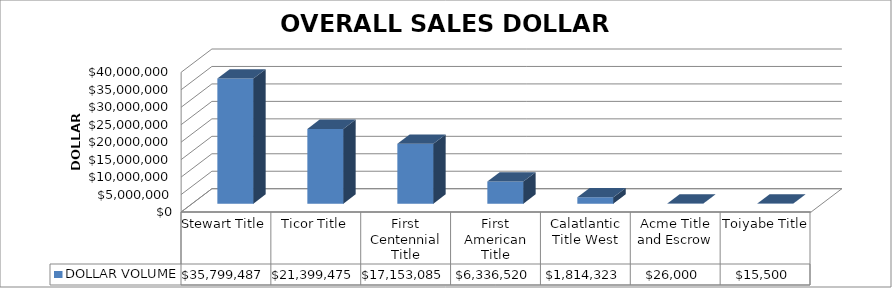
| Category | DOLLAR VOLUME |
|---|---|
| Stewart Title | 35799486.66 |
| Ticor Title | 21399475 |
| First Centennial Title | 17153085 |
| First American Title | 6336520 |
| Calatlantic Title West | 1814323 |
| Acme Title and Escrow | 26000 |
| Toiyabe Title | 15500 |